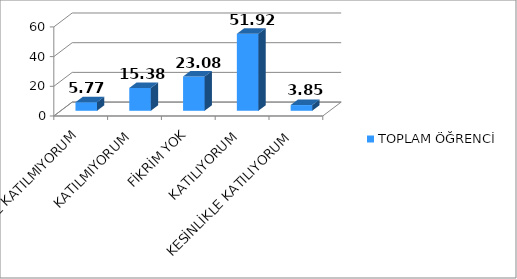
| Category | TOPLAM ÖĞRENCİ |
|---|---|
| KESİNLİKLE KATILMIYORUM | 5.77 |
| KATILMIYORUM | 15.38 |
| FİKRİM YOK | 23.08 |
| KATILIYORUM | 51.92 |
| KESİNLİKLE KATILIYORUM | 3.85 |